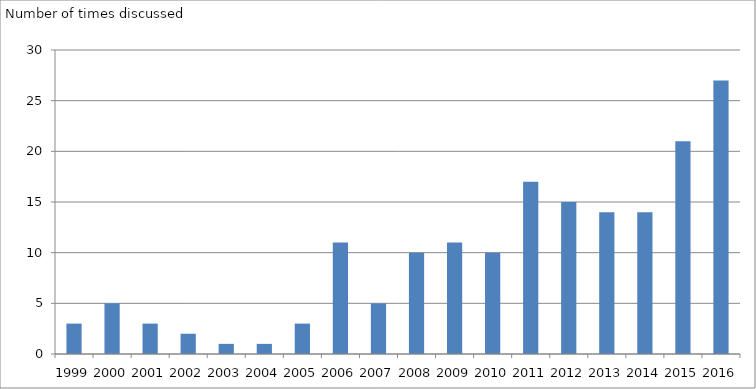
| Category | Number of times discussed |
|---|---|
| 1999 | 3 |
| 2000 | 5 |
| 2001 | 3 |
| 2002 | 2 |
| 2003 | 1 |
| 2004 | 1 |
| 2005 | 3 |
| 2006 | 11 |
| 2007 | 5 |
| 2008 | 10 |
| 2009 | 11 |
| 2010 | 10 |
| 2011 | 17 |
| 2012 | 15 |
| 2013 | 14 |
| 2014 | 14 |
| 2015 | 21 |
| 2016 | 27 |